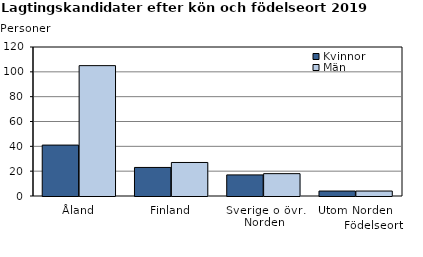
| Category | Kvinnor | Män |
|---|---|---|
| Åland | 41 | 105 |
| Finland | 23 | 27 |
| Sverige o övr. Norden | 17 | 18 |
| Utom Norden | 4 | 4 |